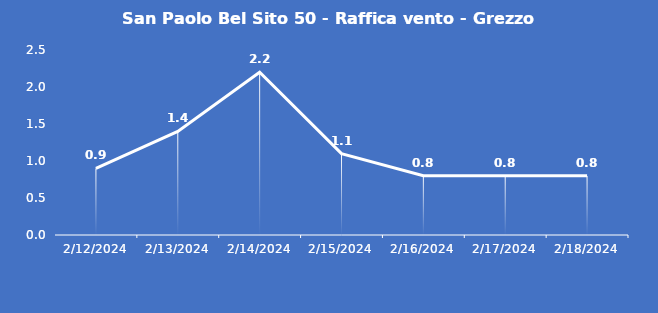
| Category | San Paolo Bel Sito 50 - Raffica vento - Grezzo (m/s) |
|---|---|
| 2/12/24 | 0.9 |
| 2/13/24 | 1.4 |
| 2/14/24 | 2.2 |
| 2/15/24 | 1.1 |
| 2/16/24 | 0.8 |
| 2/17/24 | 0.8 |
| 2/18/24 | 0.8 |